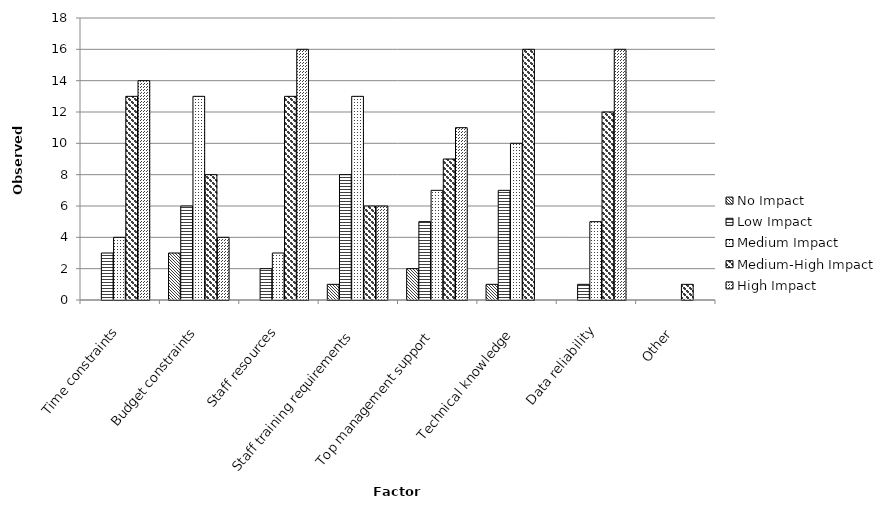
| Category | No Impact | Low Impact | Medium Impact | Medium-High Impact | High Impact |
|---|---|---|---|---|---|
| Time constraints | 0 | 3 | 4 | 13 | 14 |
| Budget constraints | 3 | 6 | 13 | 8 | 4 |
| Staff resources | 0 | 2 | 3 | 13 | 16 |
| Staff training requirements | 1 | 8 | 13 | 6 | 6 |
| Top management support | 2 | 5 | 7 | 9 | 11 |
| Technical knowledge | 1 | 7 | 10 | 16 | 0 |
| Data reliability | 0 | 1 | 5 | 12 | 16 |
| Other | 0 | 0 | 0 | 1 | 0 |